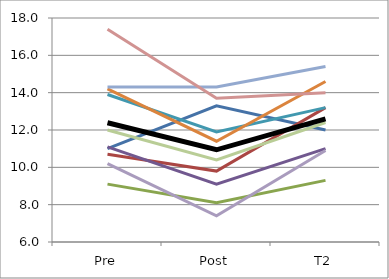
| Category | Series 0 | Series 1 | Series 2 | Series 3 | Series 4 | Series 5 | Series 6 | Series 7 | Series 8 | Series 9 | Mean |
|---|---|---|---|---|---|---|---|---|---|---|---|
| Pre | 11 | 10.7 | 9.1 | 11.1 | 13.9 | 14.2 | 14.3 | 17.4 | 12 | 10.2 | 12.39 |
| Post | 13.3 | 9.8 | 8.1 | 9.1 | 11.9 | 11.4 | 14.3 | 13.7 | 10.4 | 7.4 | 10.94 |
| T2 | 12 | 13.2 | 9.3 | 11 | 13.2 | 14.6 | 15.4 | 14 | 12.4 | 10.9 | 12.6 |